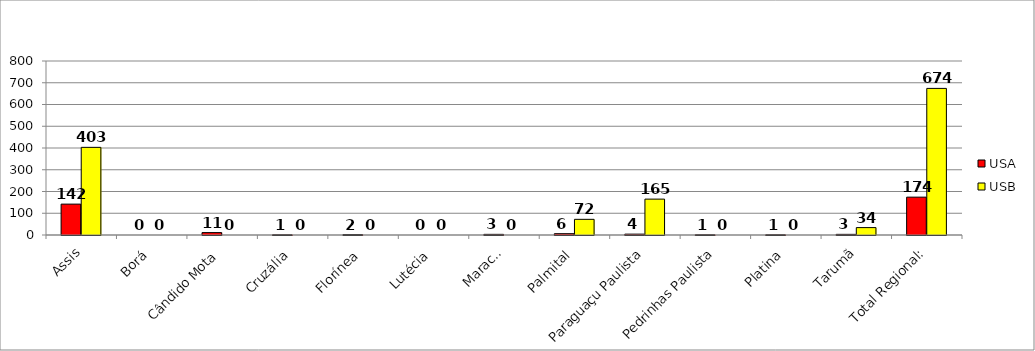
| Category | USA | USB |
|---|---|---|
| Assis | 142 | 403 |
| Borá | 0 | 0 |
| Cândido Mota | 11 | 0 |
| Cruzália | 1 | 0 |
| Florínea | 2 | 0 |
| Lutécia | 0 | 0 |
| Maracaí | 3 | 0 |
| Palmital | 6 | 72 |
| Paraguaçu Paulista | 4 | 165 |
| Pedrinhas Paulista | 1 | 0 |
| Platina | 1 | 0 |
| Tarumã | 3 | 34 |
| Total Regional: | 174 | 674 |